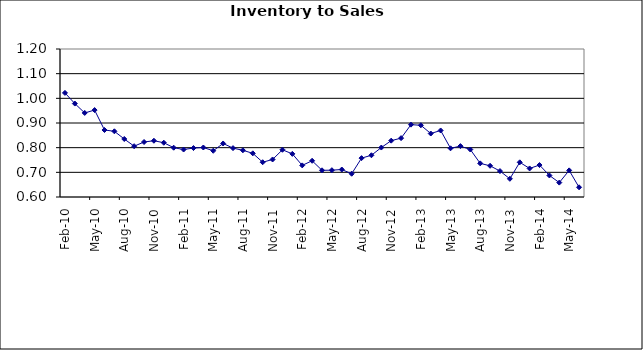
| Category | Series 0 |
|---|---|
| 2006-02-01 | 1.022 |
| 2006-03-01 | 0.979 |
| 2006-04-01 | 0.941 |
| 2006-05-01 | 0.952 |
| 2006-06-01 | 0.872 |
| 2006-07-01 | 0.866 |
| 2006-08-01 | 0.835 |
| 2006-09-01 | 0.806 |
| 2006-10-01 | 0.823 |
| 2006-11-01 | 0.828 |
| 2006-12-01 | 0.82 |
| 2007-01-01 | 0.8 |
| 2007-02-01 | 0.792 |
| 2007-03-01 | 0.798 |
| 2007-04-01 | 0.801 |
| 2007-05-01 | 0.787 |
| 2007-06-01 | 0.817 |
| 2007-07-01 | 0.798 |
| 2007-08-01 | 0.789 |
| 2007-09-01 | 0.777 |
| 2007-10-01 | 0.741 |
| 2007-11-01 | 0.752 |
| 2007-12-01 | 0.791 |
| 2008-01-01 | 0.775 |
| 2008-02-01 | 0.728 |
| 2008-03-01 | 0.747 |
| 2008-04-01 | 0.708 |
| 2008-05-01 | 0.709 |
| 2008-06-01 | 0.711 |
| 2008-07-01 | 0.694 |
| 2008-08-01 | 0.758 |
| 2008-09-01 | 0.769 |
| 2008-10-01 | 0.8 |
| 2008-11-01 | 0.828 |
| 2008-12-01 | 0.839 |
| 2009-01-01 | 0.893 |
| 2009-02-01 | 0.891 |
| 2009-03-01 | 0.857 |
| 2009-04-01 | 0.87 |
| 2009-05-01 | 0.797 |
| 2009-06-01 | 0.806 |
| 2009-07-01 | 0.793 |
| 2009-08-01 | 0.736 |
| 2009-09-01 | 0.726 |
| 2009-10-01 | 0.705 |
| 2009-11-01 | 0.674 |
| 2009-12-01 | 0.741 |
| 2010-01-01 | 0.716 |
| 2010-02-01 | 0.73 |
| 2010-03-01 | 0.687 |
| 2010-04-01 | 0.658 |
| 2010-05-01 | 0.708 |
| 2010-06-01 | 0.639 |